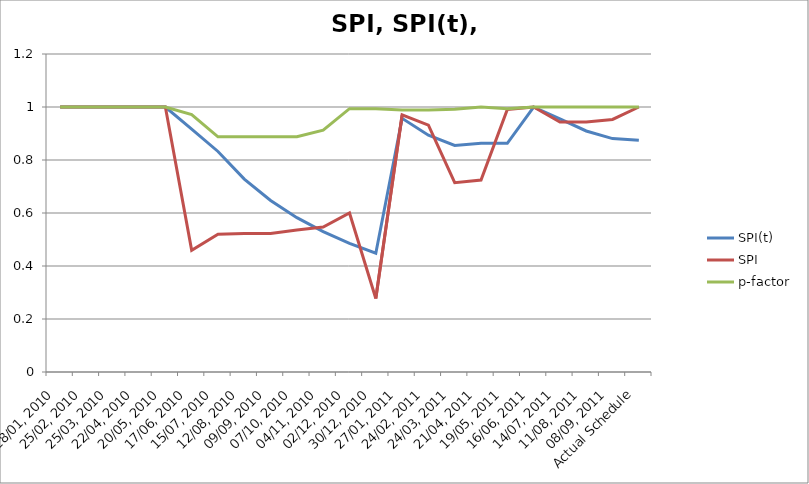
| Category | SPI(t) | SPI | p-factor |
|---|---|---|---|
| 28/01, 2010 | 1 | 1 | 1 |
| 25/02, 2010 | 1 | 1 | 1 |
| 25/03, 2010 | 1 | 1 | 1 |
| 22/04, 2010 | 1 | 1 | 1 |
| 20/05, 2010 | 1 | 1 | 1 |
| 17/06, 2010 | 0.917 | 0.46 | 0.971 |
| 15/07, 2010 | 0.832 | 0.52 | 0.887 |
| 12/08, 2010 | 0.728 | 0.523 | 0.887 |
| 09/09, 2010 | 0.647 | 0.523 | 0.887 |
| 07/10, 2010 | 0.582 | 0.536 | 0.887 |
| 04/11, 2010 | 0.53 | 0.547 | 0.913 |
| 02/12, 2010 | 0.485 | 0.6 | 0.994 |
| 30/12, 2010 | 0.448 | 0.278 | 0.994 |
| 27/01, 2011 | 0.957 | 0.97 | 0.989 |
| 24/02, 2011 | 0.893 | 0.931 | 0.989 |
| 24/03, 2011 | 0.855 | 0.714 | 0.991 |
| 21/04, 2011 | 0.864 | 0.724 | 1 |
| 19/05, 2011 | 0.863 | 0.991 | 0.993 |
| 16/06, 2011 | 1 | 1 | 1 |
| 14/07, 2011 | 0.955 | 0.944 | 1 |
| 11/08, 2011 | 0.91 | 0.944 | 1 |
| 08/09, 2011 | 0.881 | 0.953 | 1 |
| Actual Schedule | 0.874 | 1 | 1 |